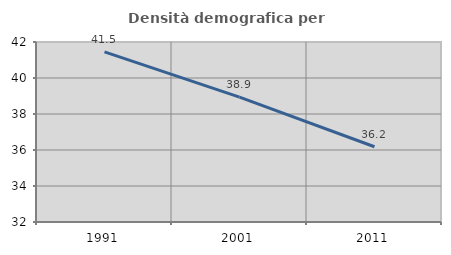
| Category | Densità demografica |
|---|---|
| 1991.0 | 41.454 |
| 2001.0 | 38.934 |
| 2011.0 | 36.181 |